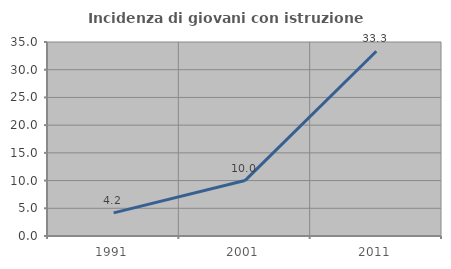
| Category | Incidenza di giovani con istruzione universitaria |
|---|---|
| 1991.0 | 4.167 |
| 2001.0 | 10 |
| 2011.0 | 33.333 |